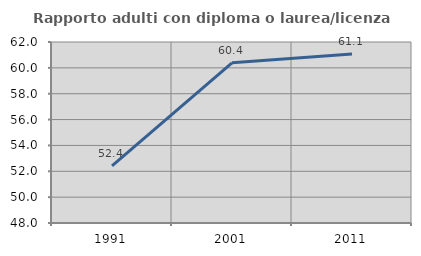
| Category | Rapporto adulti con diploma o laurea/licenza media  |
|---|---|
| 1991.0 | 52.419 |
| 2001.0 | 60.391 |
| 2011.0 | 61.074 |